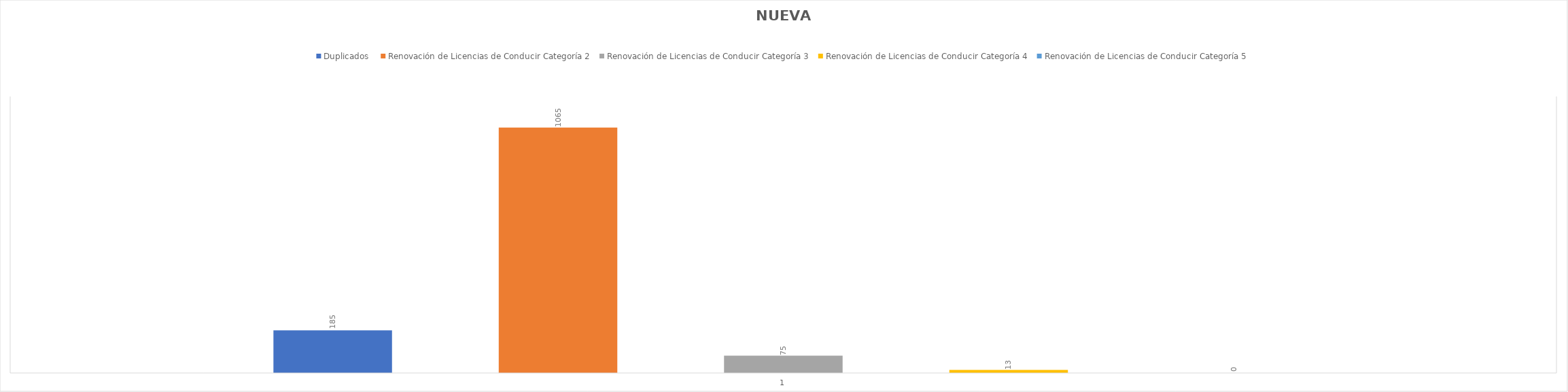
| Category | Duplicados  | Renovación de Licencias de Conducir Categoría 2 | Renovación de Licencias de Conducir Categoría 3 | Renovación de Licencias de Conducir Categoría 4 | Renovación de Licencias de Conducir Categoría 5 |
|---|---|---|---|---|---|
| 0 | 185 | 1065 | 75 | 13 | 0 |